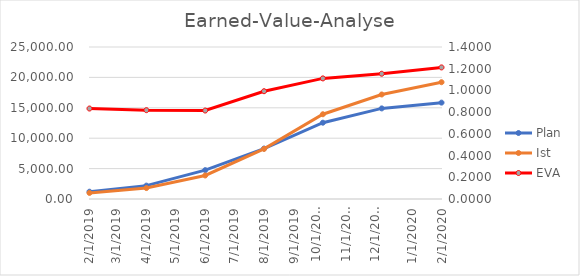
| Category | Plan | Ist |
|---|---|---|
| 2/1/19 | 1200 | 1000 |
| 4/1/19 | 2200 | 1800 |
| 6/1/19 | 4750 | 3870 |
| 8/1/19 | 8300 | 8240 |
| 10/1/19 | 12550 | 13940 |
| 12/1/19 | 14900 | 17190 |
| 2/1/20 | 15850 | 19210 |